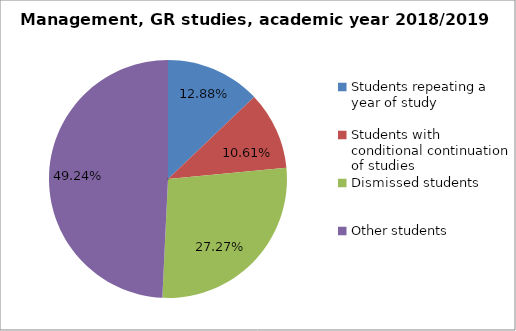
| Category | Series 0 |
|---|---|
| Students repeating a year of study | 17 |
| Students with conditional continuation of studies | 14 |
| Dismissed students | 36 |
| Other students | 65 |